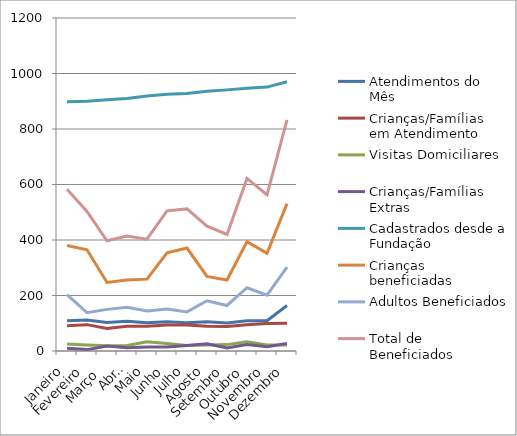
| Category | Atendimentos do Mês | Crianças/Famílias em Atendimento | Visitas Domiciliares | Crianças/Famílias Extras | Cadastrados desde a Fundação | Crianças beneficiadas | Adultos Beneficiados | Total de Beneficiados |
|---|---|---|---|---|---|---|---|---|
| Janeiro | 109 | 91 | 25 | 10 | 898 | 380 | 203 | 583 |
| Fevereiro | 112 | 95 | 22 | 5 | 900 | 365 | 138 | 503 |
| Março  | 103 | 81 | 19 | 18 | 905 | 247 | 150 | 397 |
| Abril | 107 | 89 | 20 | 12 | 910 | 256 | 158 | 414 |
| Maio | 102 | 89 | 33 | 14 | 919 | 259 | 144 | 403 |
| Junho | 105 | 94 | 27 | 14 | 925 | 354 | 151 | 505 |
| Julho | 102 | 94 | 20 | 20 | 928 | 371 | 141 | 512 |
| Agosto | 105 | 89 | 22 | 26 | 936 | 269 | 181 | 450 |
| Setembro | 101 | 88 | 23 | 11 | 941 | 256 | 164 | 420 |
| Outubro | 109 | 95 | 33 | 23 | 947 | 394 | 228 | 622 |
| Novembro | 109 | 99 | 22 | 15 | 951 | 352 | 201 | 563 |
| Dezembro | 164 | 100 | 22 | 27 | 970 | 531 | 302 | 833 |